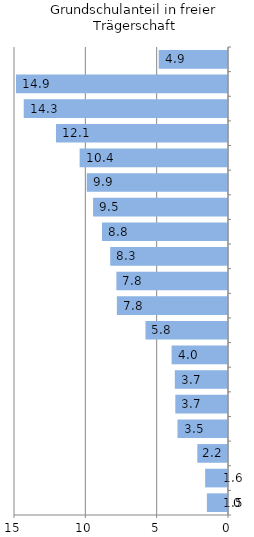
| Category | Series 0 |
|---|---|
| 0 | 1.481 |
| 1 | 1.602 |
| 2 | 2.152 |
| 3 | 3.54 |
| 4 | 3.694 |
| 5 | 3.727 |
| 6 | 3.953 |
| 7 | 5.785 |
| 8 | 7.79 |
| 9 | 7.822 |
| 10 | 8.257 |
| 11 | 8.831 |
| 12 | 9.457 |
| 13 | 9.901 |
| 14 | 10.4 |
| 15 | 12.055 |
| 16 | 14.319 |
| 17 | 14.861 |
| 18 | 4.856 |